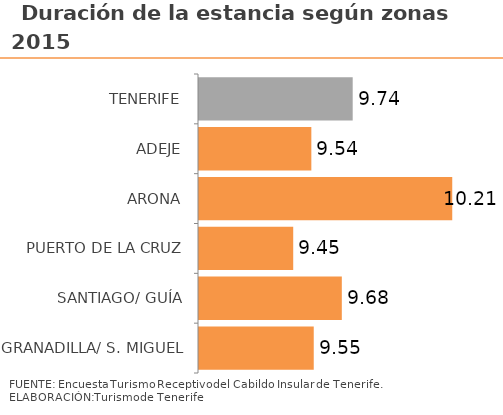
| Category | 2015 |
|---|---|
| TENERIFE | 9.737 |
| ADEJE | 9.539 |
| ARONA | 10.214 |
| PUERTO DE LA CRUZ | 9.452 |
| SANTIAGO/ GUÍA | 9.685 |
| GRANADILLA/ S. MIGUEL | 9.55 |